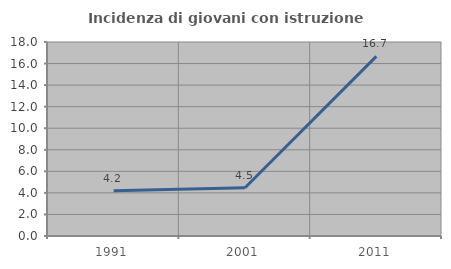
| Category | Incidenza di giovani con istruzione universitaria |
|---|---|
| 1991.0 | 4.202 |
| 2001.0 | 4.478 |
| 2011.0 | 16.667 |